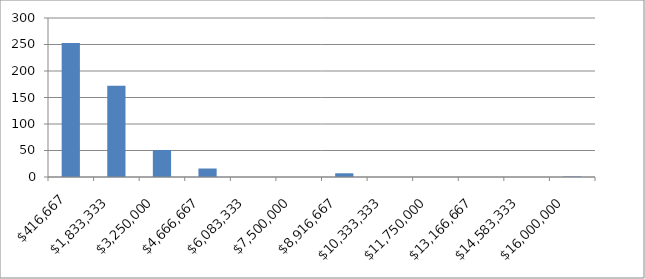
| Category | Series 0 |
|---|---|
| 416666.66666666674 | 253 |
| 1833333.3333333335 | 172 |
| 3250000.0 | 51 |
| 4666666.666666667 | 16 |
| 6083333.333333334 | 0 |
| 7500000.000000001 | 0 |
| 8916666.666666668 | 7 |
| 10333333.333333334 | 0 |
| 11750000.0 | 0 |
| 13166666.666666666 | 0 |
| 14583333.333333332 | 0 |
| 16000000.0 | 1 |